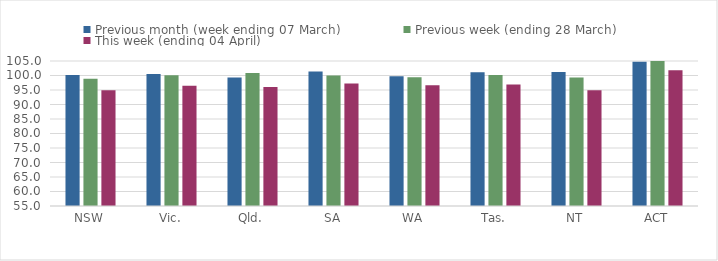
| Category | Previous month (week ending 07 March) | Previous week (ending 28 March) | This week (ending 04 April) |
|---|---|---|---|
| NSW | 100.207 | 98.854 | 94.912 |
| Vic. | 100.552 | 100.129 | 96.488 |
| Qld. | 99.315 | 100.852 | 96.001 |
| SA | 101.338 | 99.989 | 97.269 |
| WA | 99.764 | 99.411 | 96.631 |
| Tas. | 101.114 | 100.149 | 96.931 |
| NT | 101.241 | 99.317 | 94.91 |
| ACT | 104.705 | 105.129 | 101.823 |